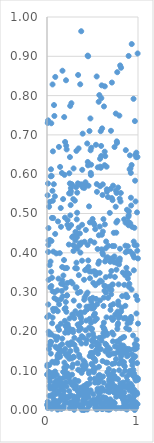
| Category | Series 0 |
|---|---|
| 0.001 | 0.09 |
| 0.002 | 0.014 |
| 0.003 | 0.236 |
| 0.004 | 0.111 |
| 0.005 | 0.115 |
| 0.006 | 0.011 |
| 0.007 | 0.546 |
| 0.008 | 0.73 |
| 0.009 | 0.021 |
| 0.01 | 0.005 |
| 0.011 | 0.576 |
| 0.012 | 0.737 |
| 0.013 | 0.402 |
| 0.014 | 0.268 |
| 0.015 | 0.42 |
| 0.016 | 0.463 |
| 0.017 | 0.431 |
| 0.018 | 0.331 |
| 0.019 | 0.199 |
| 0.02 | 0.241 |
| 0.021 | 0.155 |
| 0.022 | 0.097 |
| 0.023 | 0.517 |
| 0.024 | 0.192 |
| 0.025 | 0.114 |
| 0.026 | 0.036 |
| 0.027 | 0.081 |
| 0.028 | 0.061 |
| 0.029 | 0.369 |
| 0.03 | 0.165 |
| 0.031 | 0.529 |
| 0.032 | 0.072 |
| 0.033 | 0.433 |
| 0.034 | 0.312 |
| 0.035 | 0.055 |
| 0.036 | 0.195 |
| 0.037 | 0.173 |
| 0.038 | 0.057 |
| 0.039 | 0.378 |
| 0.04 | 0.166 |
| 0.041 | 0.595 |
| 0.042 | 0.143 |
| 0.043 | 0.015 |
| 0.044 | 0.612 |
| 0.045 | 0.173 |
| 0.046 | 0.352 |
| 0.047 | 0.73 |
| 0.048 | 0.316 |
| 0.049 | 0.43 |
| 0.05 | 0.192 |
| 0.051 | 0.595 |
| 0.052 | 0.003 |
| 0.053 | 0.093 |
| 0.054 | 0.489 |
| 0.055 | 0.336 |
| 0.056 | 0.085 |
| 0.057 | 0.221 |
| 0.058 | 0.123 |
| 0.059 | 0.039 |
| 0.06 | 0.558 |
| 0.061 | 0.828 |
| 0.062 | 0.235 |
| 0.063 | 0.302 |
| 0.064 | 0.532 |
| 0.065 | 0.658 |
| 0.066 | 0.033 |
| 0.067 | 0.257 |
| 0.068 | 0.016 |
| 0.069 | 0.488 |
| 0.07 | 0.403 |
| 0.071 | 0.092 |
| 0.072 | 0.252 |
| 0.073 | 0.025 |
| 0.074 | 0.061 |
| 0.075 | 0.575 |
| 0.076 | 0.017 |
| 0.077 | 0.776 |
| 0.078 | 0.086 |
| 0.079 | 0.095 |
| 0.08 | 0.05 |
| 0.081 | 0.748 |
| 0.082 | 0.285 |
| 0.083 | 0.07 |
| 0.084 | 0.12 |
| 0.085 | 0.008 |
| 0.086 | 0.3 |
| 0.087 | 0.544 |
| 0.088 | 0.187 |
| 0.089 | 0.098 |
| 0.09 | 0.448 |
| 0.091 | 0.848 |
| 0.092 | 0.021 |
| 0.093 | 0.161 |
| 0.094 | 0.257 |
| 0.095 | 0.021 |
| 0.096 | 0.015 |
| 0.097 | 0.013 |
| 0.098 | 0.059 |
| 0.099 | 0.01 |
| 0.1 | 0.013 |
| 0.101 | 0.041 |
| 0.102 | 0.398 |
| 0.103 | 0.023 |
| 0.104 | 0.178 |
| 0.105 | 0.125 |
| 0.106 | 0.158 |
| 0.107 | 0.09 |
| 0.108 | 0.074 |
| 0.109 | 0.07 |
| 0.11 | 0.28 |
| 0.111 | 0.12 |
| 0.112 | 0.003 |
| 0.113 | 0.075 |
| 0.114 | 0.138 |
| 0.115 | 0.305 |
| 0.116 | 0.001 |
| 0.117 | 0.132 |
| 0.118 | 0.251 |
| 0.119 | 0.185 |
| 0.12 | 0.211 |
| 0.121 | 0.48 |
| 0.122 | 0.156 |
| 0.123 | 0.003 |
| 0.124 | 0.018 |
| 0.125 | 0.143 |
| 0.126 | 0.334 |
| 0.127 | 0.063 |
| 0.128 | 0.049 |
| 0.129 | 0.007 |
| 0.13 | 0.157 |
| 0.131 | 0.669 |
| 0.132 | 0.204 |
| 0.133 | 0.269 |
| 0.134 | 0.155 |
| 0.135 | 0.139 |
| 0.136 | 0.044 |
| 0.137 | 0.073 |
| 0.138 | 0.081 |
| 0.139 | 0.162 |
| 0.14 | 0.399 |
| 0.141 | 0.148 |
| 0.142 | 0.024 |
| 0.143 | 0.005 |
| 0.144 | 0.619 |
| 0.145 | 0.136 |
| 0.146 | 0.075 |
| 0.147 | 0.068 |
| 0.148 | 0.005 |
| 0.149 | 0.069 |
| 0.15 | 0.028 |
| 0.151 | 0.514 |
| 0.152 | 0.22 |
| 0.153 | 0.282 |
| 0.154 | 0.466 |
| 0.155 | 0.036 |
| 0.156 | 0.321 |
| 0.157 | 0.028 |
| 0.158 | 0.003 |
| 0.159 | 0.056 |
| 0.16 | 0.003 |
| 0.161 | 0.057 |
| 0.162 | 0.303 |
| 0.163 | 0.036 |
| 0.164 | 0.603 |
| 0.165 | 0.167 |
| 0.166 | 0.055 |
| 0.167 | 0.364 |
| 0.168 | 0.182 |
| 0.169 | 0.33 |
| 0.17 | 0.863 |
| 0.171 | 0.035 |
| 0.172 | 0.289 |
| 0.173 | 0.15 |
| 0.174 | 0.064 |
| 0.175 | 0.065 |
| 0.176 | 0.32 |
| 0.177 | 0.537 |
| 0.178 | 0.037 |
| 0.179 | 0.097 |
| 0.18 | 0.342 |
| 0.181 | 0.082 |
| 0.182 | 0.096 |
| 0.183 | 0.005 |
| 0.184 | 0.011 |
| 0.185 | 0.067 |
| 0.186 | 0.048 |
| 0.187 | 0.382 |
| 0.188 | 0.037 |
| 0.189 | 0.745 |
| 0.19 | 0.108 |
| 0.191 | 0.121 |
| 0.192 | 0.598 |
| 0.193 | 0.257 |
| 0.194 | 0.018 |
| 0.195 | 0.361 |
| 0.196 | 0.227 |
| 0.197 | 0.489 |
| 0.198 | 0.102 |
| 0.199 | 0.682 |
| 0.2 | 0.197 |
| 0.201 | 0.155 |
| 0.202 | 0.214 |
| 0.203 | 0.142 |
| 0.204 | 0.26 |
| 0.205 | 0.311 |
| 0.206 | 0.028 |
| 0.207 | 0.275 |
| 0.208 | 0.03 |
| 0.209 | 0.839 |
| 0.21 | 0.071 |
| 0.211 | 0.673 |
| 0.212 | 0.088 |
| 0.213 | 0.25 |
| 0.214 | 0.112 |
| 0.215 | 0.06 |
| 0.216 | 0.663 |
| 0.217 | 0.291 |
| 0.218 | 0.111 |
| 0.219 | 0.361 |
| 0.22 | 0.206 |
| 0.221 | 0.292 |
| 0.222 | 0.084 |
| 0.223 | 0.136 |
| 0.224 | 0.471 |
| 0.225 | 0.323 |
| 0.226 | 0.483 |
| 0.227 | 0.169 |
| 0.228 | 0.218 |
| 0.229 | 0.033 |
| 0.23 | 0.088 |
| 0.231 | 0.092 |
| 0.232 | 0.143 |
| 0.233 | 0.211 |
| 0.234 | 0.197 |
| 0.235 | 0.2 |
| 0.236 | 0.032 |
| 0.237 | 0.018 |
| 0.238 | 0.138 |
| 0.239 | 0.463 |
| 0.24 | 0.421 |
| 0.241 | 0.168 |
| 0.242 | 0.082 |
| 0.243 | 0.551 |
| 0.244 | 0.048 |
| 0.245 | 0.602 |
| 0.246 | 0.13 |
| 0.247 | 0.165 |
| 0.248 | 0.233 |
| 0.249 | 0.035 |
| 0.25 | 0.005 |
| 0.251 | 0.577 |
| 0.252 | 0.644 |
| 0.253 | 0.07 |
| 0.254 | 0.169 |
| 0.255 | 0.774 |
| 0.256 | 0.495 |
| 0.257 | 0.072 |
| 0.258 | 0.15 |
| 0.259 | 0.551 |
| 0.26 | 0.521 |
| 0.261 | 0.205 |
| 0.262 | 0.565 |
| 0.263 | 0.557 |
| 0.264 | 0.326 |
| 0.265 | 0.471 |
| 0.266 | 0.037 |
| 0.267 | 0.02 |
| 0.268 | 0.781 |
| 0.269 | 0.173 |
| 0.27 | 0.012 |
| 0.271 | 0.575 |
| 0.272 | 0.131 |
| 0.273 | 0.013 |
| 0.274 | 0.572 |
| 0.275 | 0.109 |
| 0.276 | 0.09 |
| 0.277 | 0.44 |
| 0.278 | 0.243 |
| 0.279 | 0.066 |
| 0.28 | 0.063 |
| 0.281 | 0.322 |
| 0.282 | 0.016 |
| 0.283 | 0.169 |
| 0.284 | 0.204 |
| 0.285 | 0.116 |
| 0.286 | 0.442 |
| 0.287 | 0.198 |
| 0.288 | 0.24 |
| 0.289 | 0.537 |
| 0.29 | 0.419 |
| 0.291 | 0.405 |
| 0.292 | 0.615 |
| 0.293 | 0.135 |
| 0.294 | 0.278 |
| 0.295 | 0.134 |
| 0.296 | 0.035 |
| 0.297 | 0.067 |
| 0.298 | 0.001 |
| 0.299 | 0.03 |
| 0.3 | 0.234 |
| 0.301 | 0.184 |
| 0.302 | 0.166 |
| 0.303 | 0.02 |
| 0.304 | 0.055 |
| 0.305 | 0.026 |
| 0.306 | 0.533 |
| 0.307 | 0.008 |
| 0.308 | 0.077 |
| 0.309 | 0.028 |
| 0.31 | 0.361 |
| 0.311 | 0.432 |
| 0.312 | 0.251 |
| 0.313 | 0.453 |
| 0.314 | 0.415 |
| 0.315 | 0.311 |
| 0.316 | 0.443 |
| 0.317 | 0.027 |
| 0.318 | 0.055 |
| 0.319 | 0.062 |
| 0.32 | 0.567 |
| 0.321 | 0.016 |
| 0.322 | 0.155 |
| 0.323 | 0.659 |
| 0.324 | 0.375 |
| 0.325 | 0.312 |
| 0.326 | 0.151 |
| 0.327 | 0.485 |
| 0.328 | 0.36 |
| 0.329 | 0.44 |
| 0.33 | 0.449 |
| 0.331 | 0.502 |
| 0.332 | 0.553 |
| 0.333 | 0.028 |
| 0.334 | 0.41 |
| 0.335 | 0.023 |
| 0.336 | 0.119 |
| 0.337 | 0.217 |
| 0.338 | 0.034 |
| 0.339 | 0.577 |
| 0.34 | 0.298 |
| 0.341 | 0.048 |
| 0.342 | 0.852 |
| 0.343 | 0.102 |
| 0.344 | 0.244 |
| 0.345 | 0.074 |
| 0.346 | 0.046 |
| 0.347 | 0.666 |
| 0.348 | 0.464 |
| 0.349 | 0.217 |
| 0.35 | 0.343 |
| 0.351 | 0.202 |
| 0.352 | 0.178 |
| 0.353 | 0.14 |
| 0.354 | 0.211 |
| 0.355 | 0.265 |
| 0.356 | 0.014 |
| 0.357 | 0.008 |
| 0.358 | 0.424 |
| 0.359 | 0.039 |
| 0.36 | 0.134 |
| 0.361 | 0.449 |
| 0.362 | 0.573 |
| 0.363 | 0.42 |
| 0.364 | 0.1 |
| 0.365 | 0.829 |
| 0.366 | 0.3 |
| 0.367 | 0.4 |
| 0.368 | 0.247 |
| 0.369 | 0.248 |
| 0.37 | 0.238 |
| 0.371 | 0.041 |
| 0.372 | 0.057 |
| 0.373 | 0.207 |
| 0.374 | 0.233 |
| 0.375 | 0.012 |
| 0.376 | 0.964 |
| 0.377 | 0.223 |
| 0.378 | 0.574 |
| 0.379 | 0.169 |
| 0.38 | 0.426 |
| 0.381 | 0.095 |
| 0.382 | 0.188 |
| 0.383 | 0.01 |
| 0.384 | 0 |
| 0.385 | 0.38 |
| 0.386 | 0.471 |
| 0.387 | 0.611 |
| 0.388 | 0.102 |
| 0.389 | 0.003 |
| 0.39 | 0.113 |
| 0.391 | 0.011 |
| 0.392 | 0.703 |
| 0.393 | 0.566 |
| 0.394 | 0.054 |
| 0.395 | 0.024 |
| 0.396 | 0.015 |
| 0.397 | 0.045 |
| 0.398 | 0.103 |
| 0.399 | 0.184 |
| 0.4 | 0.113 |
| 0.401 | 0.126 |
| 0.402 | 0.032 |
| 0.403 | 0.061 |
| 0.404 | 0.048 |
| 0.405 | 0.001 |
| 0.406 | 0.023 |
| 0.407 | 0.331 |
| 0.408 | 0 |
| 0.409 | 0.28 |
| 0.41 | 0.565 |
| 0.411 | 0.574 |
| 0.412 | 0.249 |
| 0.413 | 0.428 |
| 0.414 | 0.287 |
| 0.415 | 0.121 |
| 0.416 | 0.05 |
| 0.417 | 0.027 |
| 0.418 | 0.019 |
| 0.419 | 0.356 |
| 0.42 | 0.063 |
| 0.421 | 0.047 |
| 0.422 | 0.106 |
| 0.423 | 0.58 |
| 0.424 | 0.046 |
| 0.425 | 0.203 |
| 0.426 | 0.041 |
| 0.427 | 0.458 |
| 0.428 | 0.113 |
| 0.429 | 0.17 |
| 0.43 | 0.573 |
| 0.431 | 0.228 |
| 0.432 | 0.293 |
| 0.433 | 0.036 |
| 0.434 | 0.263 |
| 0.435 | 0.358 |
| 0.436 | 0.179 |
| 0.437 | 0.054 |
| 0.438 | 0.036 |
| 0.439 | 0.066 |
| 0.44 | 0.256 |
| 0.441 | 0.063 |
| 0.442 | 0.678 |
| 0.443 | 0.001 |
| 0.444 | 0.036 |
| 0.445 | 0.299 |
| 0.446 | 0.42 |
| 0.447 | 0.902 |
| 0.448 | 0.631 |
| 0.449 | 0.034 |
| 0.45 | 0.043 |
| 0.451 | 0.622 |
| 0.452 | 0.9 |
| 0.453 | 0.38 |
| 0.454 | 0.018 |
| 0.455 | 0.364 |
| 0.456 | 0.571 |
| 0.457 | 0.032 |
| 0.458 | 0.19 |
| 0.459 | 0.01 |
| 0.46 | 0.264 |
| 0.461 | 0.093 |
| 0.462 | 0.518 |
| 0.463 | 0.098 |
| 0.464 | 0.21 |
| 0.465 | 0.011 |
| 0.466 | 0.353 |
| 0.467 | 0.71 |
| 0.468 | 0.067 |
| 0.469 | 0.137 |
| 0.47 | 0.232 |
| 0.471 | 0.477 |
| 0.472 | 0.335 |
| 0.473 | 0.017 |
| 0.474 | 0.046 |
| 0.475 | 0.282 |
| 0.476 | 0.079 |
| 0.477 | 0.742 |
| 0.478 | 0.43 |
| 0.479 | 0.661 |
| 0.48 | 0.05 |
| 0.481 | 0.603 |
| 0.482 | 0.145 |
| 0.483 | 0.598 |
| 0.484 | 0.222 |
| 0.485 | 0.624 |
| 0.486 | 0.259 |
| 0.487 | 0.667 |
| 0.488 | 0.276 |
| 0.489 | 0.118 |
| 0.49 | 0.205 |
| 0.491 | 0.177 |
| 0.492 | 0.352 |
| 0.493 | 0.163 |
| 0.494 | 0.207 |
| 0.495 | 0.024 |
| 0.496 | 0.02 |
| 0.497 | 0.268 |
| 0.498 | 0.114 |
| 0.499 | 0.146 |
| 0.5 | 0.143 |
| 0.501 | 0.486 |
| 0.502 | 0.264 |
| 0.503 | 0.286 |
| 0.504 | 0.134 |
| 0.505 | 0.194 |
| 0.506 | 0.175 |
| 0.507 | 0.102 |
| 0.508 | 0.258 |
| 0.509 | 0.323 |
| 0.51 | 0.04 |
| 0.511 | 0.476 |
| 0.512 | 0.017 |
| 0.513 | 0.176 |
| 0.514 | 0.24 |
| 0.515 | 0.096 |
| 0.516 | 0.027 |
| 0.517 | 0.185 |
| 0.518 | 0.242 |
| 0.519 | 0.353 |
| 0.52 | 0.426 |
| 0.521 | 0.262 |
| 0.522 | 0.471 |
| 0.523 | 0.107 |
| 0.524 | 0.13 |
| 0.525 | 0.08 |
| 0.526 | 0.227 |
| 0.527 | 0.245 |
| 0.528 | 0.07 |
| 0.529 | 0.006 |
| 0.53 | 0.46 |
| 0.531 | 0.318 |
| 0.532 | 0.124 |
| 0.533 | 0.106 |
| 0.534 | 0.012 |
| 0.535 | 0.012 |
| 0.536 | 0.344 |
| 0.537 | 0.35 |
| 0.538 | 0.675 |
| 0.539 | 0.283 |
| 0.54 | 0.152 |
| 0.541 | 0.002 |
| 0.542 | 0.006 |
| 0.543 | 0.02 |
| 0.544 | 0.165 |
| 0.545 | 0.072 |
| 0.546 | 0.849 |
| 0.547 | 0.575 |
| 0.548 | 0.232 |
| 0.549 | 0.555 |
| 0.55 | 0.171 |
| 0.551 | 0.269 |
| 0.552 | 0.149 |
| 0.553 | 0.002 |
| 0.554 | 0.048 |
| 0.555 | 0.054 |
| 0.556 | 0.41 |
| 0.557 | 0.07 |
| 0.558 | 0.617 |
| 0.559 | 0.025 |
| 0.56 | 0.143 |
| 0.561 | 0.031 |
| 0.562 | 0.158 |
| 0.563 | 0.004 |
| 0.564 | 0.372 |
| 0.565 | 0.087 |
| 0.566 | 0.324 |
| 0.567 | 0.07 |
| 0.568 | 0.784 |
| 0.569 | 0.165 |
| 0.57 | 0.445 |
| 0.571 | 0.11 |
| 0.572 | 0.378 |
| 0.573 | 0.184 |
| 0.574 | 0.052 |
| 0.575 | 0.801 |
| 0.576 | 0.041 |
| 0.577 | 0.078 |
| 0.578 | 0.089 |
| 0.579 | 0.349 |
| 0.58 | 0.467 |
| 0.581 | 0.049 |
| 0.582 | 0.279 |
| 0.583 | 0.639 |
| 0.584 | 0.569 |
| 0.585 | 0.619 |
| 0.586 | 0.329 |
| 0.587 | 0.016 |
| 0.588 | 0.025 |
| 0.589 | 0.08 |
| 0.59 | 0.71 |
| 0.591 | 0.616 |
| 0.592 | 0.155 |
| 0.593 | 0.047 |
| 0.594 | 0.184 |
| 0.595 | 0.672 |
| 0.596 | 0.646 |
| 0.597 | 0.794 |
| 0.598 | 0.056 |
| 0.599 | 0.176 |
| 0.6 | 0.409 |
| 0.601 | 0.826 |
| 0.602 | 0.327 |
| 0.603 | 0.446 |
| 0.604 | 0.012 |
| 0.605 | 0.002 |
| 0.606 | 0.717 |
| 0.607 | 0.054 |
| 0.608 | 0.002 |
| 0.609 | 0.4 |
| 0.61 | 0.547 |
| 0.611 | 0.125 |
| 0.612 | 0.212 |
| 0.613 | 0.574 |
| 0.614 | 0.454 |
| 0.615 | 0.396 |
| 0.616 | 0.085 |
| 0.617 | 0.012 |
| 0.618 | 0.033 |
| 0.619 | 0.195 |
| 0.62 | 0.486 |
| 0.621 | 0.265 |
| 0.622 | 0.07 |
| 0.623 | 0.017 |
| 0.624 | 0.286 |
| 0.625 | 0.222 |
| 0.626 | 0.772 |
| 0.627 | 0.206 |
| 0.628 | 0.189 |
| 0.629 | 0.208 |
| 0.63 | 0.316 |
| 0.631 | 0.049 |
| 0.632 | 0.304 |
| 0.633 | 0.623 |
| 0.634 | 0.657 |
| 0.635 | 0.824 |
| 0.636 | 0.472 |
| 0.637 | 0.202 |
| 0.638 | 0.378 |
| 0.639 | 0.021 |
| 0.64 | 0.646 |
| 0.641 | 0.149 |
| 0.642 | 0.315 |
| 0.643 | 0.168 |
| 0.644 | 0.031 |
| 0.645 | 0.411 |
| 0.646 | 0.338 |
| 0.647 | 0.167 |
| 0.648 | 0.299 |
| 0.649 | 0.121 |
| 0.65 | 0.429 |
| 0.651 | 0.028 |
| 0.652 | 0.002 |
| 0.653 | 0.386 |
| 0.654 | 0.236 |
| 0.655 | 0.619 |
| 0.656 | 0.195 |
| 0.657 | 0.562 |
| 0.658 | 0.02 |
| 0.659 | 0.556 |
| 0.66 | 0.154 |
| 0.661 | 0.191 |
| 0.662 | 0.007 |
| 0.663 | 0.096 |
| 0.664 | 0.12 |
| 0.665 | 0.389 |
| 0.666 | 0.161 |
| 0.667 | 0.062 |
| 0.668 | 0.06 |
| 0.669 | 0.047 |
| 0.67 | 0.542 |
| 0.671 | 0.285 |
| 0.672 | 0.003 |
| 0.673 | 0.418 |
| 0.674 | 0.022 |
| 0.675 | 0.001 |
| 0.676 | 0.141 |
| 0.677 | 0.143 |
| 0.678 | 0.05 |
| 0.679 | 0.313 |
| 0.68 | 0.104 |
| 0.681 | 0.088 |
| 0.682 | 0.049 |
| 0.683 | 0.078 |
| 0.684 | 0.073 |
| 0.685 | 0.045 |
| 0.686 | 0.059 |
| 0.687 | 0.14 |
| 0.688 | 0.307 |
| 0.689 | 0.013 |
| 0.69 | 0.502 |
| 0.691 | 0.155 |
| 0.692 | 0.001 |
| 0.693 | 0.09 |
| 0.694 | 0.341 |
| 0.695 | 0.377 |
| 0.696 | 0.027 |
| 0.697 | 0.08 |
| 0.698 | 0.255 |
| 0.699 | 0.085 |
| 0.7 | 0.563 |
| 0.701 | 0.385 |
| 0.702 | 0.266 |
| 0.703 | 0.71 |
| 0.704 | 0.063 |
| 0.705 | 0.294 |
| 0.706 | 0.235 |
| 0.707 | 0.354 |
| 0.708 | 0.305 |
| 0.709 | 0.057 |
| 0.71 | 0.012 |
| 0.711 | 0.075 |
| 0.712 | 0.539 |
| 0.713 | 0.833 |
| 0.714 | 0.069 |
| 0.715 | 0.197 |
| 0.716 | 0.318 |
| 0.717 | 0.117 |
| 0.718 | 0.417 |
| 0.719 | 0.093 |
| 0.72 | 0.534 |
| 0.721 | 0.229 |
| 0.722 | 0.32 |
| 0.723 | 0.007 |
| 0.724 | 0.175 |
| 0.725 | 0.144 |
| 0.726 | 0.571 |
| 0.727 | 0.021 |
| 0.728 | 0.387 |
| 0.729 | 0.269 |
| 0.73 | 0.192 |
| 0.731 | 0.232 |
| 0.732 | 0.083 |
| 0.733 | 0.099 |
| 0.734 | 0.451 |
| 0.735 | 0.083 |
| 0.736 | 0.045 |
| 0.737 | 0.045 |
| 0.738 | 0.376 |
| 0.739 | 0.057 |
| 0.74 | 0.417 |
| 0.741 | 0.391 |
| 0.742 | 0.669 |
| 0.743 | 0.086 |
| 0.744 | 0.018 |
| 0.745 | 0.119 |
| 0.746 | 0.338 |
| 0.747 | 0.162 |
| 0.748 | 0.06 |
| 0.749 | 0.081 |
| 0.75 | 0.243 |
| 0.751 | 0.143 |
| 0.752 | 0.006 |
| 0.753 | 0.08 |
| 0.754 | 0.056 |
| 0.755 | 0.517 |
| 0.756 | 0.754 |
| 0.757 | 0.558 |
| 0.758 | 0.004 |
| 0.759 | 0.13 |
| 0.76 | 0.034 |
| 0.761 | 0.451 |
| 0.762 | 0.477 |
| 0.763 | 0.357 |
| 0.764 | 0.552 |
| 0.765 | 0.374 |
| 0.766 | 0.048 |
| 0.767 | 0.684 |
| 0.768 | 0.174 |
| 0.769 | 0.68 |
| 0.77 | 0.16 |
| 0.771 | 0.036 |
| 0.772 | 0.86 |
| 0.773 | 0.206 |
| 0.774 | 0.482 |
| 0.775 | 0.25 |
| 0.776 | 0.216 |
| 0.777 | 0.147 |
| 0.778 | 0.381 |
| 0.779 | 0.174 |
| 0.78 | 0.079 |
| 0.781 | 0.221 |
| 0.782 | 0.566 |
| 0.783 | 0.276 |
| 0.784 | 0.005 |
| 0.785 | 0.268 |
| 0.786 | 0.158 |
| 0.787 | 0.32 |
| 0.788 | 0.234 |
| 0.789 | 0.054 |
| 0.79 | 0.239 |
| 0.791 | 0.37 |
| 0.792 | 0.118 |
| 0.793 | 0.101 |
| 0.794 | 0.047 |
| 0.795 | 0.749 |
| 0.796 | 0.248 |
| 0.797 | 0.239 |
| 0.798 | 0.38 |
| 0.799 | 0.538 |
| 0.8 | 0.386 |
| 0.801 | 0.06 |
| 0.802 | 0.41 |
| 0.803 | 0.037 |
| 0.804 | 0.877 |
| 0.805 | 0.18 |
| 0.806 | 0.068 |
| 0.807 | 0.145 |
| 0.808 | 0.53 |
| 0.809 | 0.166 |
| 0.81 | 0.035 |
| 0.811 | 0.552 |
| 0.812 | 0.136 |
| 0.813 | 0.005 |
| 0.814 | 0.871 |
| 0.815 | 0.251 |
| 0.816 | 0.127 |
| 0.817 | 0.139 |
| 0.818 | 0.05 |
| 0.819 | 0.145 |
| 0.82 | 0.123 |
| 0.821 | 0.058 |
| 0.822 | 0.26 |
| 0.823 | 0.122 |
| 0.824 | 0.157 |
| 0.825 | 0.039 |
| 0.826 | 0.29 |
| 0.827 | 0.031 |
| 0.828 | 0.091 |
| 0.829 | 0.184 |
| 0.83 | 0.036 |
| 0.831 | 0.151 |
| 0.832 | 0.006 |
| 0.833 | 0.35 |
| 0.834 | 0.156 |
| 0.835 | 0.063 |
| 0.836 | 0.07 |
| 0.837 | 0.026 |
| 0.838 | 0.152 |
| 0.839 | 0.164 |
| 0.84 | 0.065 |
| 0.841 | 0.06 |
| 0.842 | 0.233 |
| 0.843 | 0.01 |
| 0.844 | 0.114 |
| 0.845 | 0.019 |
| 0.846 | 0.122 |
| 0.847 | 0.186 |
| 0.848 | 0.485 |
| 0.849 | 0.319 |
| 0.85 | 0.045 |
| 0.851 | 0.006 |
| 0.852 | 0.011 |
| 0.853 | 0.145 |
| 0.854 | 0.033 |
| 0.855 | 0.111 |
| 0.856 | 0.004 |
| 0.857 | 0.147 |
| 0.858 | 0.1 |
| 0.859 | 0.343 |
| 0.86 | 0.234 |
| 0.861 | 0.265 |
| 0.862 | 0.418 |
| 0.863 | 0.477 |
| 0.864 | 0.02 |
| 0.865 | 0.401 |
| 0.866 | 0.661 |
| 0.867 | 0.156 |
| 0.868 | 0.057 |
| 0.869 | 0.293 |
| 0.87 | 0.022 |
| 0.871 | 0.208 |
| 0.872 | 0.013 |
| 0.873 | 0.362 |
| 0.874 | 0.288 |
| 0.875 | 0.084 |
| 0.876 | 0.35 |
| 0.877 | 0.001 |
| 0.878 | 0.06 |
| 0.879 | 0.51 |
| 0.88 | 0.137 |
| 0.881 | 0.404 |
| 0.882 | 0.151 |
| 0.883 | 0.075 |
| 0.884 | 0.287 |
| 0.885 | 0.22 |
| 0.886 | 0.023 |
| 0.887 | 0.062 |
| 0.888 | 0.417 |
| 0.889 | 0.334 |
| 0.89 | 0.229 |
| 0.891 | 0.056 |
| 0.892 | 0.479 |
| 0.893 | 0.14 |
| 0.894 | 0.492 |
| 0.895 | 0.155 |
| 0.896 | 0.47 |
| 0.897 | 0.901 |
| 0.898 | 0.496 |
| 0.899 | 0.314 |
| 0.9 | 0.506 |
| 0.901 | 0.346 |
| 0.902 | 0.091 |
| 0.903 | 0.205 |
| 0.904 | 0.034 |
| 0.905 | 0.321 |
| 0.906 | 0.01 |
| 0.907 | 0.05 |
| 0.908 | 0.612 |
| 0.909 | 0.06 |
| 0.91 | 0.099 |
| 0.911 | 0.648 |
| 0.912 | 0.154 |
| 0.913 | 0.026 |
| 0.914 | 0.403 |
| 0.915 | 0.475 |
| 0.916 | 0.223 |
| 0.917 | 0.615 |
| 0.918 | 0.054 |
| 0.919 | 0.053 |
| 0.92 | 0.067 |
| 0.921 | 0.603 |
| 0.922 | 0.54 |
| 0.923 | 0.237 |
| 0.924 | 0.013 |
| 0.925 | 0.52 |
| 0.926 | 0.231 |
| 0.927 | 0.094 |
| 0.928 | 0.125 |
| 0.929 | 0.307 |
| 0.93 | 0.623 |
| 0.931 | 0.931 |
| 0.932 | 0.049 |
| 0.933 | 0.099 |
| 0.934 | 0.466 |
| 0.935 | 0.142 |
| 0.936 | 0.061 |
| 0.937 | 0.005 |
| 0.938 | 0.114 |
| 0.939 | 0.122 |
| 0.94 | 0.021 |
| 0.941 | 0.008 |
| 0.942 | 0.397 |
| 0.943 | 0.018 |
| 0.944 | 0.043 |
| 0.945 | 0.029 |
| 0.946 | 0.19 |
| 0.947 | 0.087 |
| 0.948 | 0.393 |
| 0.949 | 0.103 |
| 0.95 | 0.131 |
| 0.951 | 0.792 |
| 0.952 | 0.012 |
| 0.953 | 0.429 |
| 0.954 | 0.355 |
| 0.955 | 0.034 |
| 0.956 | 0.156 |
| 0.957 | 0.093 |
| 0.958 | 0.388 |
| 0.959 | 0.051 |
| 0.96 | 0.464 |
| 0.961 | 0.011 |
| 0.962 | 0.42 |
| 0.963 | 0.017 |
| 0.964 | 0 |
| 0.965 | 0.168 |
| 0.966 | 0.735 |
| 0.967 | 0.154 |
| 0.968 | 0.583 |
| 0.969 | 0.136 |
| 0.97 | 0.079 |
| 0.971 | 0.649 |
| 0.972 | 0.015 |
| 0.973 | 0.531 |
| 0.974 | 0.02 |
| 0.975 | 0.075 |
| 0.976 | 0.163 |
| 0.977 | 0.01 |
| 0.978 | 0.29 |
| 0.979 | 0.084 |
| 0.98 | 0.006 |
| 0.981 | 0.643 |
| 0.982 | 0.655 |
| 0.983 | 0.246 |
| 0.984 | 0.179 |
| 0.985 | 0.419 |
| 0.986 | 0.157 |
| 0.987 | 0.045 |
| 0.988 | 0.164 |
| 0.989 | 0.503 |
| 0.99 | 0.119 |
| 0.991 | 0.041 |
| 0.992 | 0.405 |
| 0.993 | 0.28 |
| 0.994 | 0.644 |
| 0.995 | 0.015 |
| 0.996 | 0.907 |
| 0.997 | 0.077 |
| 0.998 | 0.081 |
| 0.999 | 0.386 |
| 1.0 | 0.22 |